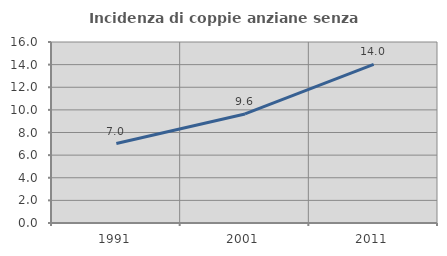
| Category | Incidenza di coppie anziane senza figli  |
|---|---|
| 1991.0 | 7.024 |
| 2001.0 | 9.639 |
| 2011.0 | 14.029 |